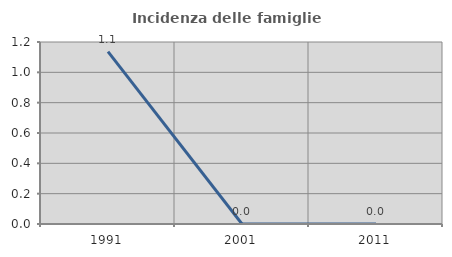
| Category | Incidenza delle famiglie numerose |
|---|---|
| 1991.0 | 1.136 |
| 2001.0 | 0 |
| 2011.0 | 0 |